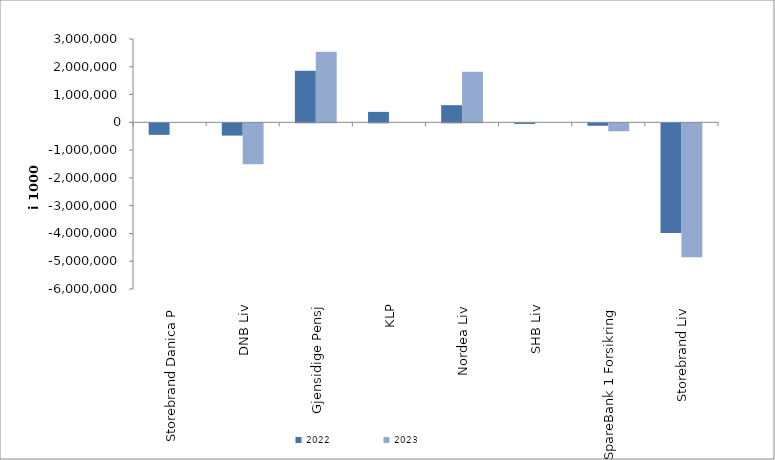
| Category | 2022 | 2023 |
|---|---|---|
| Storebrand Danica P | -414494.574 | 0 |
| DNB Liv | -440667.455 | -1469788 |
| Gjensidige Pensj | 1855585 | 2542151 |
| KLP | 376440.529 | 0 |
| Nordea Liv | 616541.348 | 1816566.378 |
| SHB Liv | -20941.515 | 0 |
| SpareBank 1 Forsikring | -87746.893 | -284342.118 |
| Storebrand Liv | -3951398.424 | -4822592.519 |